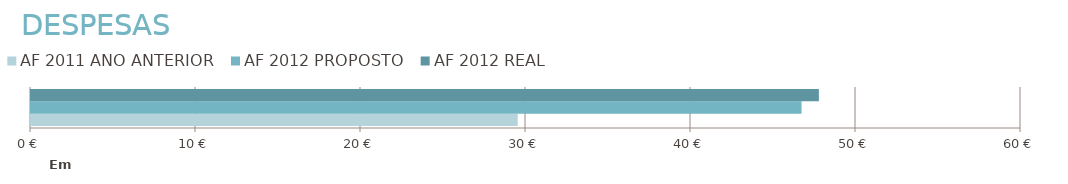
| Category | AF 2011 | AF 2012 |
|---|---|---|
| 0 | 29500 | 47750 |